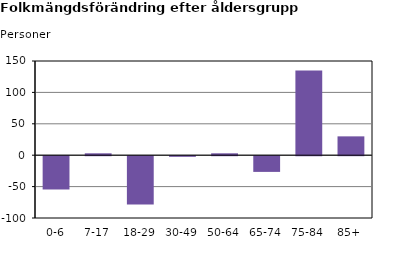
| Category | Series 2 |
|---|---|
| 0-6 | -53 |
| 7-17 | 3 |
| 18-29 | -77 |
| 30-49 | -1 |
| 50-64 | 3 |
| 65-74 | -25 |
| 75-84 | 135 |
| 85+ | 30 |